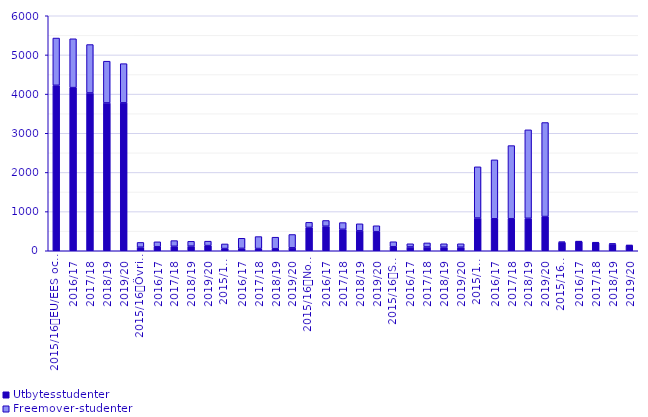
| Category | Utbytesstudenter | Freemover-studenter |
|---|---|---|
| 0 | 4224 | 1207 |
| 1 | 4165 | 1247 |
| 2 | 4029 | 1236 |
| 3 | 3774 | 1066 |
| 4 | 3776 | 1001 |
| 5 | 91 | 122 |
| 6 | 103 | 125 |
| 7 | 114 | 145 |
| 8 | 117 | 124 |
| 9 | 132 | 113 |
| 10 | 56 | 118 |
| 11 | 61 | 258 |
| 12 | 57 | 305 |
| 13 | 53 | 293 |
| 14 | 75 | 340 |
| 15 | 596 | 130 |
| 16 | 627 | 146 |
| 17 | 548 | 171 |
| 18 | 509 | 179 |
| 19 | 487 | 151 |
| 20 | 103 | 127 |
| 21 | 97 | 81 |
| 22 | 97 | 103 |
| 23 | 91 | 87 |
| 24 | 91 | 87 |
| 25 | 835 | 1308 |
| 26 | 817 | 1504 |
| 27 | 818 | 1867 |
| 28 | 829 | 2258 |
| 29 | 874 | 2400 |
| 30 | 215 | 14 |
| 31 | 233 | 10 |
| 32 | 205 | 13 |
| 33 | 170 | 13 |
| 34 | 134 | 9 |